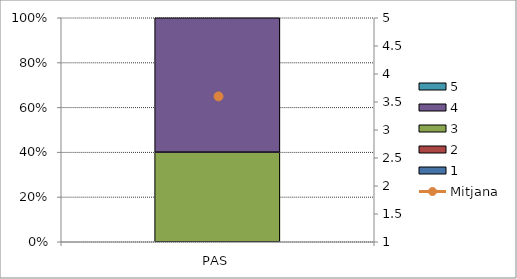
| Category | 1 | 2 | 3 | 4 | 5 |
|---|---|---|---|---|---|
| PAS | 0 | 0 | 2 | 3 | 0 |